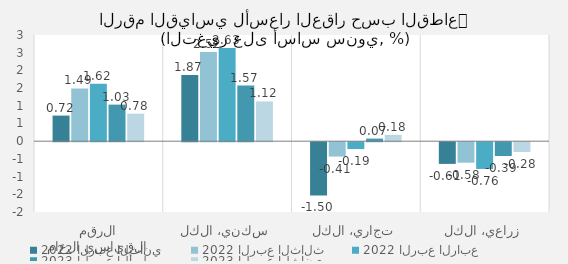
| Category | 2022 | 2023 |
|---|---|---|
| الرقم القياسي العام | 1.625 | 0.778 |
| سكني، الكل | 2.634 | 1.122 |
| تجاري، الكل | -0.194 | 0.18 |
| زراعي، الكل | -0.756 | -0.277 |